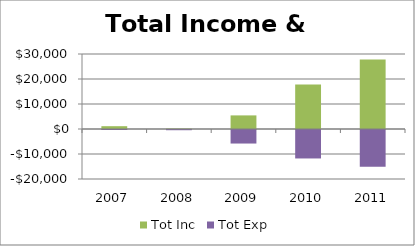
| Category | Tot Inc | Tot Exp |
|---|---|---|
| 2007.0 | 1124.62 | -9.24 |
| 2008.0 | 174.59 | -87.45 |
| 2009.0 | 5442.02 | -5416.22 |
| 2010.0 | 17819.9 | -11386.49 |
| 2011.0 | 27839.43 | -14749.05 |